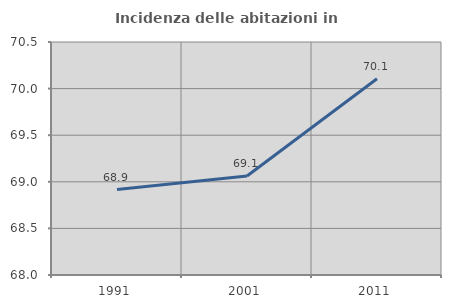
| Category | Incidenza delle abitazioni in proprietà  |
|---|---|
| 1991.0 | 68.916 |
| 2001.0 | 69.062 |
| 2011.0 | 70.105 |